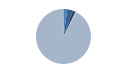
| Category | Series 0 |
|---|---|
| ARRASTRE | 20 |
| CERCO | 31 |
| PALANGRE | 15 |
| REDES DE ENMALLE | 4 |
| ARTES MENORES | 833 |
| SIN TIPO ASIGNADO | 1 |